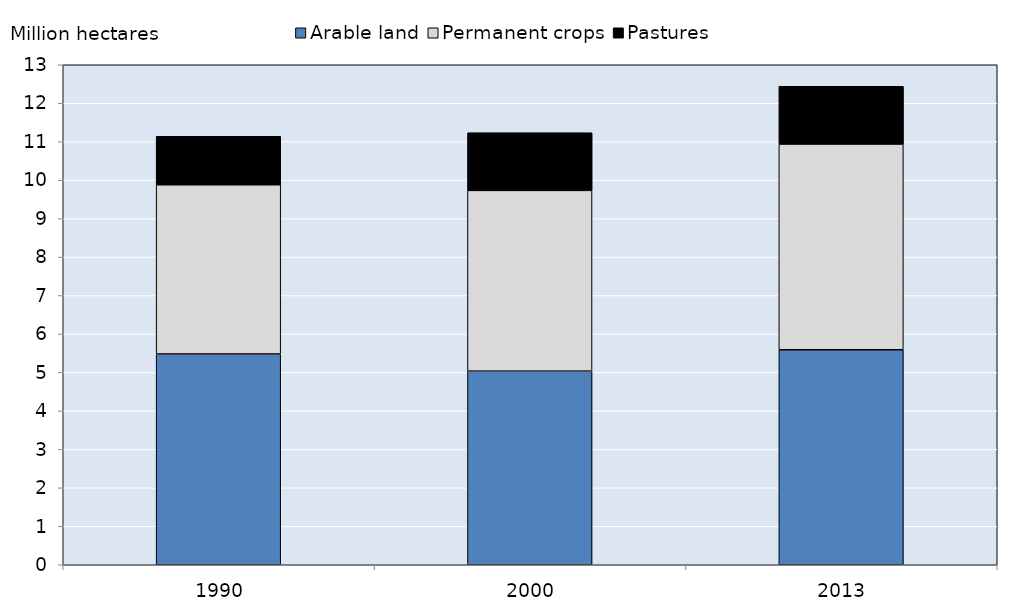
| Category | Arable land | Permanent crops | Pastures |
|---|---|---|---|
|  1990 | 5.48 | 4.4 | 1.26 |
|  2000 | 5.034 | 4.7 | 1.5 |
|  2013 | 5.59 | 5.35 | 1.5 |